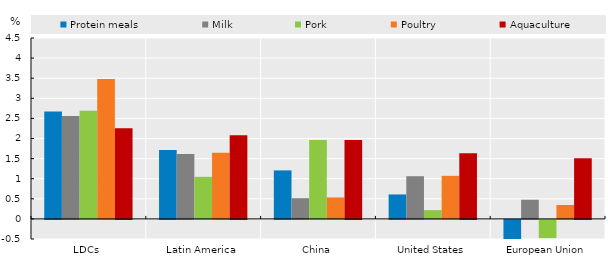
| Category | Protein meals | Milk | Pork | Poultry | Aquaculture |
|---|---|---|---|---|---|
| LDCs | 2.672 | 2.561 | 2.689 | 3.48 | 2.258 |
| Latin America | 1.713 | 1.617 | 1.046 | 1.649 | 2.078 |
| China | 1.207 | 0.515 | 1.963 | 0.534 | 1.961 |
| United States | 0.608 | 1.062 | 0.218 | 1.071 | 1.631 |
| European Union | -0.551 | 0.476 | -0.453 | 0.346 | 1.506 |